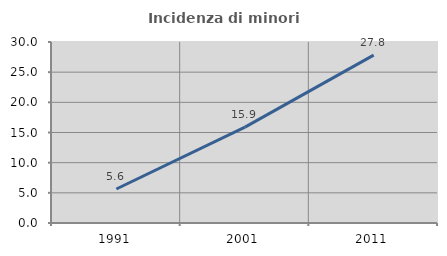
| Category | Incidenza di minori stranieri |
|---|---|
| 1991.0 | 5.634 |
| 2001.0 | 15.888 |
| 2011.0 | 27.823 |